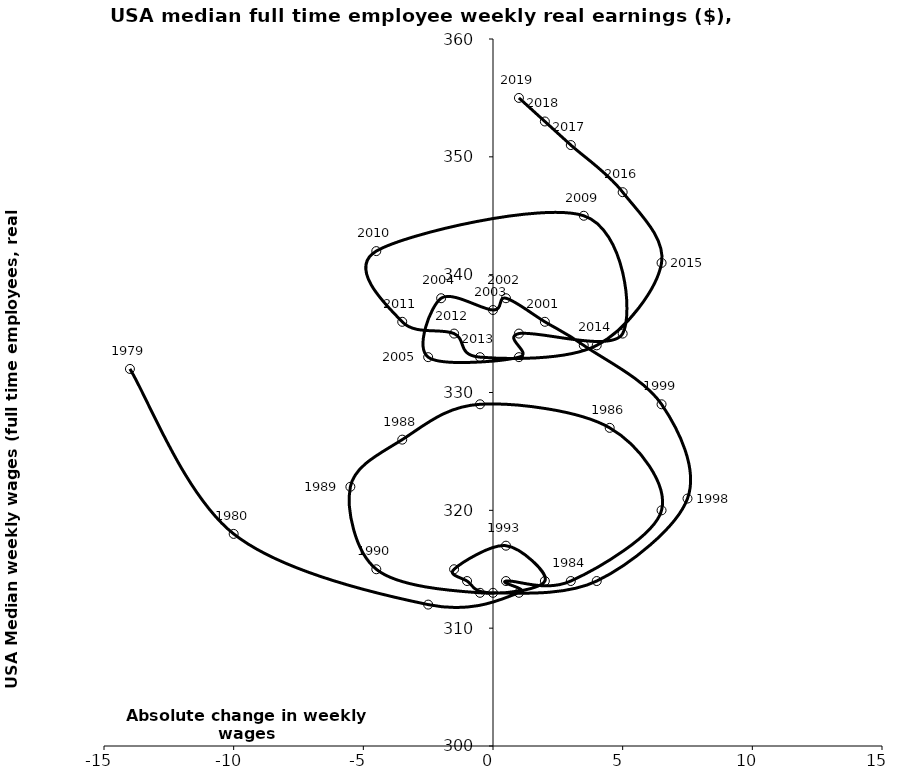
| Category | Series 0 |
|---|---|
| -14.0 | 332 |
| -10.0 | 318 |
| -2.5 | 312 |
| 1.0 | 313 |
| 0.5 | 314 |
| 3.0 | 314 |
| 6.5 | 320 |
| 4.5 | 327 |
| -0.5 | 329 |
| -3.5 | 326 |
| -5.5 | 322 |
| -4.5 | 315 |
| -0.5 | 313 |
| 2.0 | 314 |
| 0.5 | 317 |
| -1.5 | 315 |
| -1.0 | 314 |
| 0.0 | 313 |
| 4.0 | 314 |
| 7.5 | 321 |
| 6.5 | 329 |
| 3.5 | 334 |
| 2.0 | 336 |
| 0.5 | 338 |
| 0.0 | 337 |
| -2.0 | 338 |
| -2.5 | 333 |
| 1.0 | 333 |
| 1.0 | 335 |
| 5.0 | 335 |
| 3.5 | 345 |
| -4.5 | 342 |
| -3.5 | 336 |
| -1.5 | 335 |
| -0.5 | 333 |
| 4.0 | 334 |
| 6.5 | 341 |
| 5.0 | 347 |
| 3.0 | 351 |
| 2.0 | 353 |
| 1.0 | 355 |